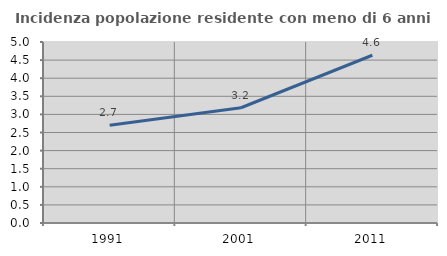
| Category | Incidenza popolazione residente con meno di 6 anni |
|---|---|
| 1991.0 | 2.698 |
| 2001.0 | 3.184 |
| 2011.0 | 4.634 |